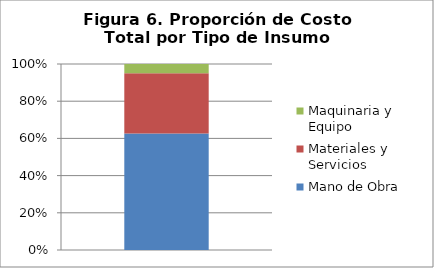
| Category | Mano de Obra | Materiales y Servicios | Maquinaria y Equipo |
|---|---|---|---|
| 0 | 95860 | 49346.4 | 7704 |